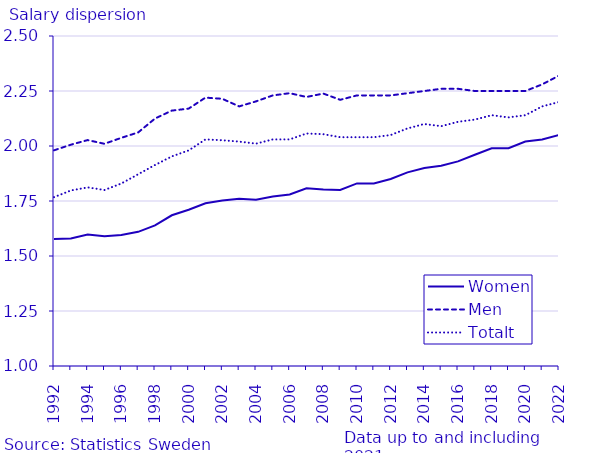
| Category | Women | Men | Totalt |
|---|---|---|---|
| 1992.0 | 1.578 | 1.98 | 1.768 |
| 1993.0 | 1.58 | 2.006 | 1.798 |
| 1994.0 | 1.598 | 2.027 | 1.812 |
| 1995.0 | 1.59 | 2.01 | 1.8 |
| 1996.0 | 1.596 | 2.037 | 1.83 |
| 1997.0 | 1.61 | 2.062 | 1.871 |
| 1998.0 | 1.639 | 2.125 | 1.914 |
| 1999.0 | 1.685 | 2.161 | 1.953 |
| 2000.0 | 1.71 | 2.17 | 1.98 |
| 2001.0 | 1.74 | 2.22 | 2.03 |
| 2002.0 | 1.752 | 2.214 | 2.026 |
| 2003.0 | 1.76 | 2.18 | 2.02 |
| 2004.0 | 1.756 | 2.203 | 2.011 |
| 2005.0 | 1.77 | 2.23 | 2.03 |
| 2006.0 | 1.78 | 2.24 | 2.03 |
| 2007.0 | 1.808 | 2.223 | 2.057 |
| 2008.0 | 1.802 | 2.238 | 2.054 |
| 2009.0 | 1.8 | 2.21 | 2.04 |
| 2010.0 | 1.83 | 2.23 | 2.04 |
| 2011.0 | 1.83 | 2.23 | 2.04 |
| 2012.0 | 1.85 | 2.23 | 2.05 |
| 2013.0 | 1.88 | 2.24 | 2.08 |
| 2014.0 | 1.9 | 2.25 | 2.1 |
| 2015.0 | 1.91 | 2.26 | 2.09 |
| 2016.0 | 1.93 | 2.26 | 2.11 |
| 2017.0 | 1.96 | 2.25 | 2.12 |
| 2018.0 | 1.99 | 2.25 | 2.14 |
| 2019.0 | 1.99 | 2.25 | 2.13 |
| 2020.0 | 2.02 | 2.25 | 2.14 |
| 2021.0 | 2.03 | 2.28 | 2.18 |
| 2022.0 | 2.05 | 2.32 | 2.2 |